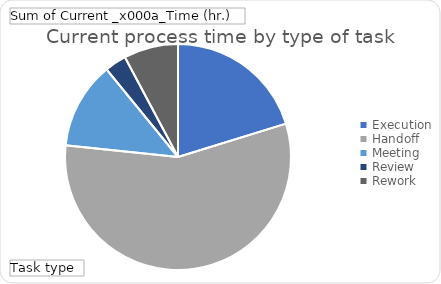
| Category | Total |
|---|---|
| Execution | 13 |
| Handoff | 36.25 |
| Meeting | 8 |
| Review | 2 |
| Rework | 5 |